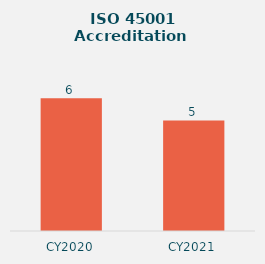
| Category | Series 0 |
|---|---|
| CY2020 | 6 |
| CY2021 | 5 |